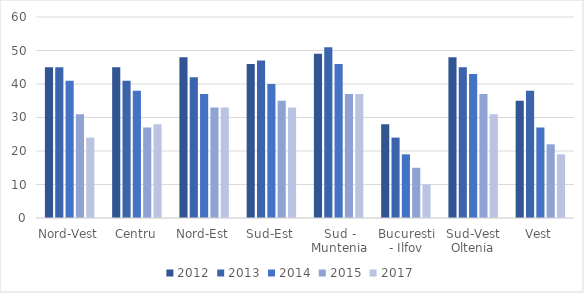
| Category | 2012 | 2013 | 2014 | 2015 | 2017 |
|---|---|---|---|---|---|
| Nord-Vest | 45 | 45 | 41 | 31 | 24 |
| Centru | 45 | 41 | 38 | 27 | 28 |
| Nord-Est | 48 | 42 | 37 | 33 | 33 |
| Sud-Est | 46 | 47 | 40 | 35 | 33 |
| Sud - Muntenia | 49 | 51 | 46 | 37 | 37 |
| Bucuresti - Ilfov | 28 | 24 | 19 | 15 | 10 |
| Sud-Vest Oltenia | 48 | 45 | 43 | 37 | 31 |
| Vest | 35 | 38 | 27 | 22 | 19 |